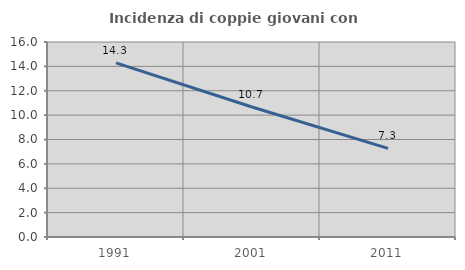
| Category | Incidenza di coppie giovani con figli |
|---|---|
| 1991.0 | 14.286 |
| 2001.0 | 10.665 |
| 2011.0 | 7.277 |